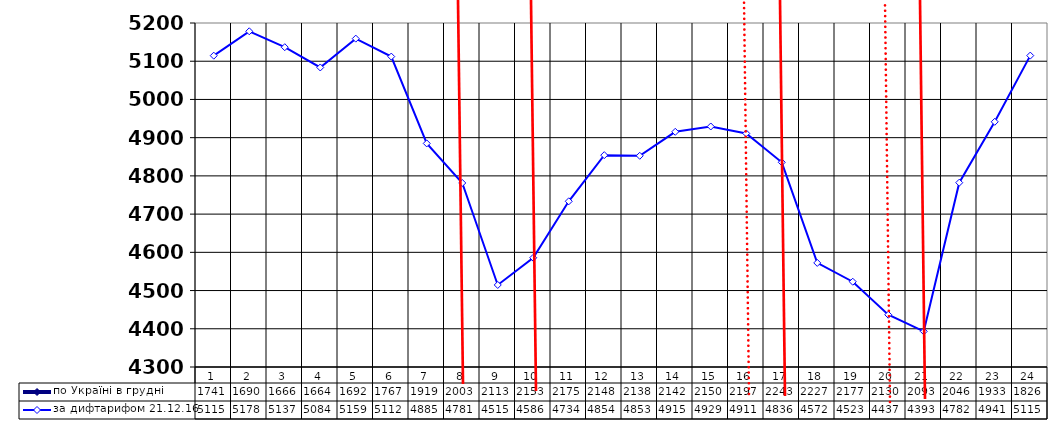
| Category | по Україні в грудні | за дифтарифом 21.12.16 |
|---|---|---|
| 0 | 17417.5 | 5114.526 |
| 1 | 16899.5 | 5178.259 |
| 2 | 16667.409 | 5136.71 |
| 3 | 16642.909 | 5083.62 |
| 4 | 16924.636 | 5159.115 |
| 5 | 17673.864 | 5112.146 |
| 6 | 19197.409 | 4884.931 |
| 7 | 20036 | 4781.441 |
| 8 | 21135.045 | 4514.625 |
| 9 | 21537.273 | 4585.904 |
| 10 | 21755.045 | 4733.504 |
| 11 | 21483.682 | 4854.208 |
| 12 | 21389.409 | 4852.579 |
| 13 | 21420.909 | 4915.321 |
| 14 | 21508.136 | 4929.232 |
| 15 | 21979.227 | 4911.029 |
| 16 | 22433.591 | 4835.57 |
| 17 | 22275.955 | 4572.357 |
| 18 | 21776.955 | 4523.11 |
| 19 | 21306.864 | 4436.689 |
| 20 | 20931.864 | 4393.273 |
| 21 | 20465.909 | 4782.271 |
| 22 | 19331.227 | 4941.494 |
| 23 | 18263.818 | 5114.702 |